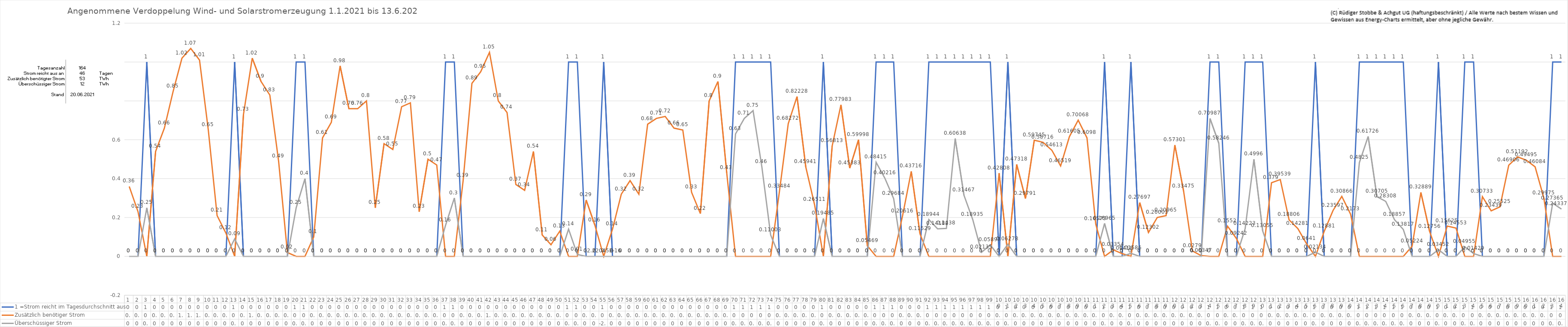
| Category | 1 =Strom reicht im Tagesdurchschnitt aus | Zusätzlich benötiger Strom | Überschüssiger Strom |
|---|---|---|---|
| 0 | 0 | 0.36 | 0 |
| 1 | 0 | 0.23 | 0 |
| 2 | 1 | 0 | 0.25 |
| 3 | 0 | 0.54 | 0 |
| 4 | 0 | 0.66 | 0 |
| 5 | 0 | 0.85 | 0 |
| 6 | 0 | 1.02 | 0 |
| 7 | 0 | 1.07 | 0 |
| 8 | 0 | 1.01 | 0 |
| 9 | 0 | 0.65 | 0 |
| 10 | 0 | 0.21 | 0 |
| 11 | 0 | 0.12 | 0 |
| 12 | 1 | 0 | 0.09 |
| 13 | 0 | 0.73 | 0 |
| 14 | 0 | 1.02 | 0 |
| 15 | 0 | 0.9 | 0 |
| 16 | 0 | 0.83 | 0 |
| 17 | 0 | 0.49 | 0 |
| 18 | 0 | 0.02 | 0 |
| 19 | 1 | 0 | 0.25 |
| 20 | 1 | 0 | 0.4 |
| 21 | 0 | 0.1 | 0 |
| 22 | 0 | 0.61 | 0 |
| 23 | 0 | 0.69 | 0 |
| 24 | 0 | 0.98 | 0 |
| 25 | 0 | 0.76 | 0 |
| 26 | 0 | 0.76 | 0 |
| 27 | 0 | 0.8 | 0 |
| 28 | 0 | 0.25 | 0 |
| 29 | 0 | 0.58 | 0 |
| 30 | 0 | 0.55 | 0 |
| 31 | 0 | 0.77 | 0 |
| 32 | 0 | 0.79 | 0 |
| 33 | 0 | 0.23 | 0 |
| 34 | 0 | 0.5 | 0 |
| 35 | 0 | 0.47 | 0 |
| 36 | 1 | 0 | 0.16 |
| 37 | 1 | 0 | 0.3 |
| 38 | 0 | 0.39 | 0 |
| 39 | 0 | 0.89 | 0 |
| 40 | 0 | 0.95 | 0 |
| 41 | 0 | 1.05 | 0 |
| 42 | 0 | 0.8 | 0 |
| 43 | 0 | 0.74 | 0 |
| 44 | 0 | 0.37 | 0 |
| 45 | 0 | 0.34 | 0 |
| 46 | 0 | 0.54 | 0 |
| 47 | 0 | 0.11 | 0 |
| 48 | 0 | 0.06 | 0 |
| 49 | 0 | 0.13 | 0 |
| 50 | 1 | 0 | 0.14 |
| 51 | 1 | 0 | 0.01 |
| 52 | 0 | 0.29 | 0 |
| 53 | 0 | 0.16 | 0 |
| 54 | 1 | 0 | 0 |
| 55 | 0 | 0.14 | 0 |
| 56 | 0 | 0.32 | 0 |
| 57 | 0 | 0.39 | 0 |
| 58 | 0 | 0.32 | 0 |
| 59 | 0 | 0.68 | 0 |
| 60 | 0 | 0.71 | 0 |
| 61 | 0 | 0.72 | 0 |
| 62 | 0 | 0.66 | 0 |
| 63 | 0 | 0.65 | 0 |
| 64 | 0 | 0.33 | 0 |
| 65 | 0 | 0.22 | 0 |
| 66 | 0 | 0.8 | 0 |
| 67 | 0 | 0.9 | 0 |
| 68 | 0 | 0.43 | 0 |
| 69 | 1 | 0 | 0.63 |
| 70 | 1 | 0 | 0.71 |
| 71 | 1 | 0 | 0.75 |
| 72 | 1 | 0 | 0.46 |
| 73 | 1 | 0 | 0.11 |
| 74 | 0 | 0.335 | 0 |
| 75 | 0 | 0.683 | 0 |
| 76 | 0 | 0.822 | 0 |
| 77 | 0 | 0.459 | 0 |
| 78 | 0 | 0.265 | 0 |
| 79 | 1 | 0 | 0.195 |
| 80 | 0 | 0.568 | 0 |
| 81 | 0 | 0.78 | 0 |
| 82 | 0 | 0.454 | 0 |
| 83 | 0 | 0.6 | 0 |
| 84 | 0 | 0.055 | 0 |
| 85 | 1 | 0 | 0.484 |
| 86 | 1 | 0 | 0.402 |
| 87 | 1 | 0 | 0.297 |
| 88 | 0 | 0.206 | 0 |
| 89 | 0 | 0.437 | 0 |
| 90 | 0 | 0.115 | 0 |
| 91 | 1 | 0 | 0.189 |
| 92 | 1 | 0 | 0.142 |
| 93 | 1 | 0 | 0.144 |
| 94 | 1 | 0 | 0.606 |
| 95 | 1 | 0 | 0.315 |
| 96 | 1 | 0 | 0.189 |
| 97 | 1 | 0 | 0.021 |
| 98 | 1 | 0 | 0.059 |
| 99 | 0 | 0.428 | 0 |
| 100 | 1 | 0 | 0.063 |
| 101 | 0 | 0.473 | 0 |
| 102 | 0 | 0.298 | 0 |
| 103 | 0 | 0.597 | 0 |
| 104 | 0 | 0.587 | 0 |
| 105 | 0 | 0.546 | 0 |
| 106 | 0 | 0.465 | 0 |
| 107 | 0 | 0.616 | 0 |
| 108 | 0 | 0.701 | 0 |
| 109 | 0 | 0.61 | 0 |
| 110 | 0 | 0.166 | 0 |
| 111 | 1 | 0 | 0.17 |
| 112 | 0 | 0.034 | 0 |
| 113 | 0 | 0.014 | 0 |
| 114 | 1 | 0 | 0.016 |
| 115 | 0 | 0.277 | 0 |
| 116 | 0 | 0.123 | 0 |
| 117 | 0 | 0.2 | 0 |
| 118 | 0 | 0.21 | 0 |
| 119 | 0 | 0.573 | 0 |
| 120 | 0 | 0.335 | 0 |
| 121 | 0 | 0.028 | 0 |
| 122 | 0 | 0.003 | 0 |
| 123 | 1 | 0 | 0.71 |
| 124 | 1 | 0 | 0.582 |
| 125 | 0 | 0.155 | 0 |
| 126 | 0 | 0.092 | 0 |
| 127 | 1 | 0 | 0.142 |
| 128 | 1 | 0 | 0.5 |
| 129 | 1 | 0 | 0.131 |
| 130 | 0 | 0.379 | 0 |
| 131 | 0 | 0.395 | 0 |
| 132 | 0 | 0.188 | 0 |
| 133 | 0 | 0.143 | 0 |
| 134 | 0 | 0.064 | 0 |
| 135 | 1 | 0 | 0.021 |
| 136 | 0 | 0.129 | 0 |
| 137 | 0 | 0.236 | 0 |
| 138 | 0 | 0.309 | 0 |
| 139 | 0 | 0.217 | 0 |
| 140 | 1 | 0 | 0.482 |
| 141 | 1 | 0 | 0.617 |
| 142 | 1 | 0 | 0.307 |
| 143 | 1 | 0 | 0.283 |
| 144 | 1 | 0 | 0.189 |
| 145 | 1 | 0 | 0.138 |
| 146 | 0 | 0.052 | 0 |
| 147 | 0 | 0.329 | 0 |
| 148 | 0 | 0.128 | 0 |
| 149 | 1 | 0 | 0.035 |
| 150 | 0 | 0.156 | 0 |
| 151 | 0 | 0.146 | 0 |
| 152 | 1 | 0 | 0.05 |
| 153 | 1 | 0 | 0.014 |
| 154 | 0 | 0.307 | 0 |
| 155 | 0 | 0.234 | 0 |
| 156 | 0 | 0.255 | 0 |
| 157 | 0 | 0.469 | 0 |
| 158 | 0 | 0.512 | 0 |
| 159 | 0 | 0.495 | 0 |
| 160 | 0 | 0.461 | 0 |
| 161 | 0 | 0.3 | 0 |
| 162 | 1 | 0 | 0.274 |
| 163 | 1 | 0 | 0.243 |